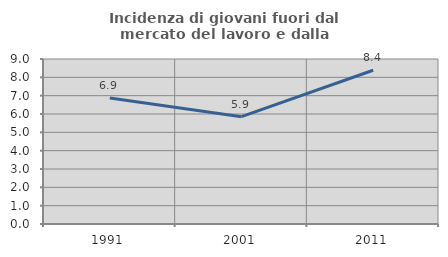
| Category | Incidenza di giovani fuori dal mercato del lavoro e dalla formazione  |
|---|---|
| 1991.0 | 6.874 |
| 2001.0 | 5.853 |
| 2011.0 | 8.385 |